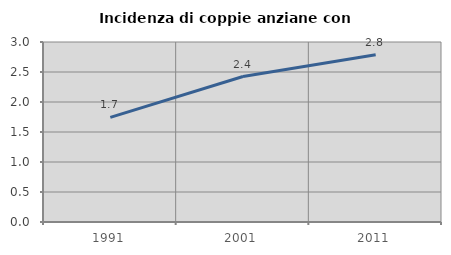
| Category | Incidenza di coppie anziane con figli |
|---|---|
| 1991.0 | 1.743 |
| 2001.0 | 2.424 |
| 2011.0 | 2.786 |